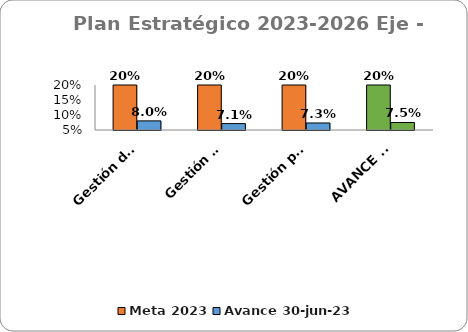
| Category | Meta 2023 | Avance 30-jun-23 |
|---|---|---|
| Gestión de capacidades - TECNOLOGÍA | 0.2 | 0.08 |
| Gestión misional - MODELO DE SUPERVISÍÓN | 0.2 | 0.071 |
| Gestión por resultados - MIPG | 0.2 | 0.073 |
| AVANCE PROMEDIO | 0.2 | 0.075 |